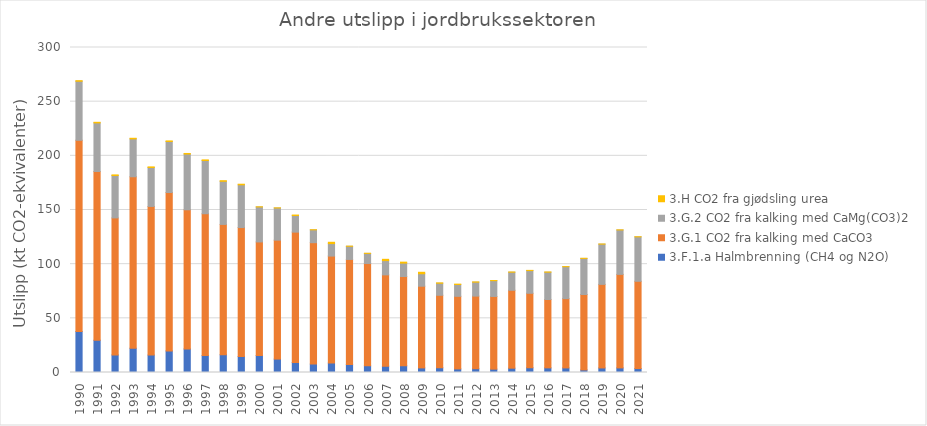
| Category | 3.F.1.a Halmbrenning (CH4 og N2O) | 3.G.1 CO2 fra kalking med CaCO3 | 3.G.2 CO2 fra kalking med CaMg(CO3)2 | 3.H CO2 fra gjødsling urea |
|---|---|---|---|---|
| 1990.0 | 37.863 | 176.475 | 54.496 | 0.553 |
| 1991.0 | 29.762 | 155.786 | 44.857 | 0.553 |
| 1992.0 | 16.201 | 126.518 | 39.132 | 0.553 |
| 1993.0 | 22.387 | 158.308 | 34.959 | 0.553 |
| 1994.0 | 16.072 | 137.225 | 35.945 | 0.553 |
| 1995.0 | 19.911 | 146.22 | 47.087 | 0.553 |
| 1996.0 | 21.728 | 128.469 | 51.436 | 0.553 |
| 1997.0 | 15.634 | 130.918 | 49.154 | 0.553 |
| 1998.0 | 16.416 | 120.266 | 39.807 | 0.553 |
| 1999.0 | 14.747 | 119.058 | 39.448 | 0.553 |
| 2000.0 | 15.713 | 104.806 | 32.301 | 0.112 |
| 2001.0 | 12.388 | 109.788 | 29.694 | 0.075 |
| 2002.0 | 9.283 | 120.296 | 15.343 | 0.426 |
| 2003.0 | 7.794 | 112.051 | 11.823 | 0.075 |
| 2004.0 | 8.745 | 98.724 | 11.524 | 1.216 |
| 2005.0 | 7.337 | 97.035 | 12.144 | 0.1 |
| 2006.0 | 6.131 | 94.514 | 9.287 | 0.124 |
| 2007.0 | 5.82 | 84.304 | 13.175 | 1.175 |
| 2008.0 | 6.148 | 82.488 | 12.342 | 0.893 |
| 2009.0 | 4.243 | 75.413 | 11.508 | 1.348 |
| 2010.0 | 4.379 | 66.892 | 11.115 | 0.325 |
| 2011.0 | 3.312 | 66.99 | 10.943 | 0.328 |
| 2012.0 | 3.509 | 67.017 | 12.856 | 0.226 |
| 2013.0 | 3.109 | 67.082 | 14.583 | 0.16 |
| 2014.0 | 3.983 | 71.925 | 16.682 | 0.163 |
| 2015.0 | 4.38 | 68.737 | 20.939 | 0.216 |
| 2016.0 | 4.278 | 63.116 | 25.197 | 0.189 |
| 2017.0 | 4.218 | 63.987 | 29.455 | 0.092 |
| 2018.0 | 2.401 | 69.603 | 33.303 | 0.103 |
| 2019.0 | 4.198 | 77.15 | 37.152 | 0.104 |
| 2020.0 | 4.246 | 86.322 | 41 | 0.082 |
| 2021.0 | 3.646 | 80.561 | 41 | 0.096 |